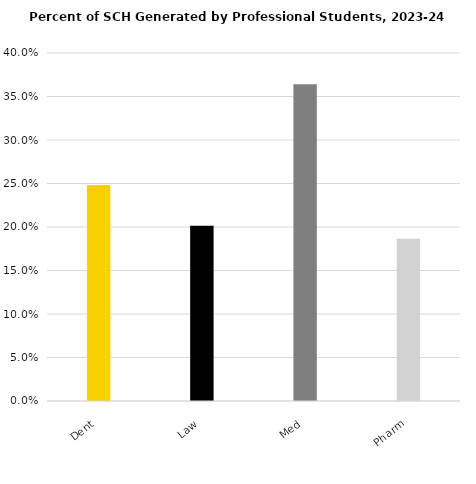
| Category | Series 0 |
|---|---|
| Dent | 0.248 |
| Law | 0.201 |
| Med | 0.364 |
| Pharm | 0.186 |